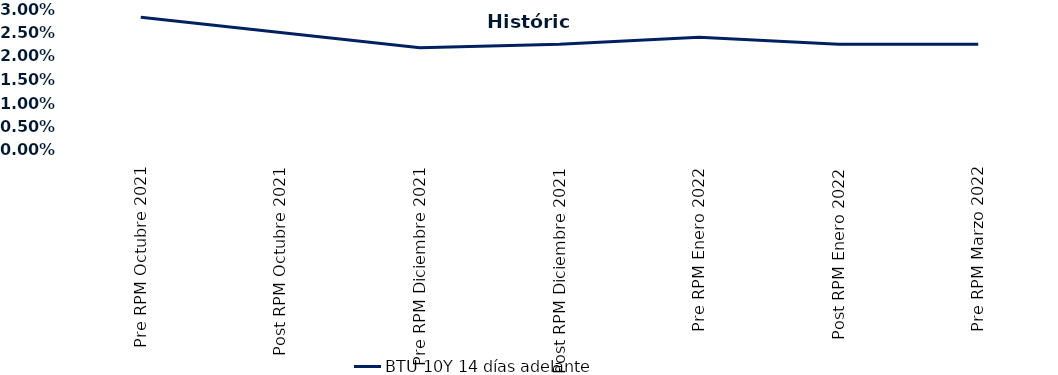
| Category | BTU 10Y 14 días adelante |
|---|---|
| Pre RPM Octubre 2021 | 0.028 |
| Post RPM Octubre 2021 | 0.025 |
| Pre RPM Diciembre 2021 | 0.022 |
| Post RPM Diciembre 2021 | 0.022 |
| Pre RPM Enero 2022 | 0.024 |
| Post RPM Enero 2022 | 0.022 |
| Pre RPM Marzo 2022 | 0.022 |